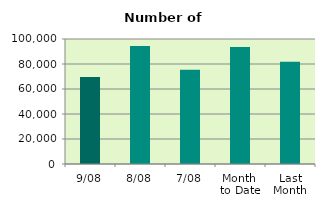
| Category | Series 0 |
|---|---|
| 9/08 | 69542 |
| 8/08 | 94494 |
| 7/08 | 75302 |
| Month 
to Date | 93664.286 |
| Last
Month | 81818 |